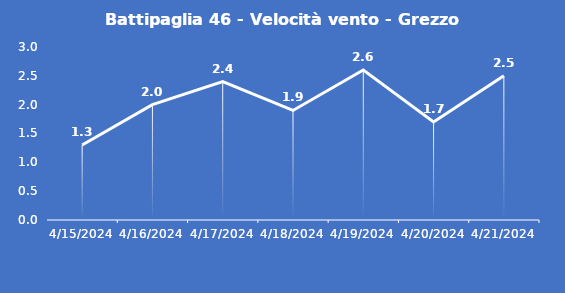
| Category | Battipaglia 46 - Velocità vento - Grezzo (m/s) |
|---|---|
| 4/15/24 | 1.3 |
| 4/16/24 | 2 |
| 4/17/24 | 2.4 |
| 4/18/24 | 1.9 |
| 4/19/24 | 2.6 |
| 4/20/24 | 1.7 |
| 4/21/24 | 2.5 |